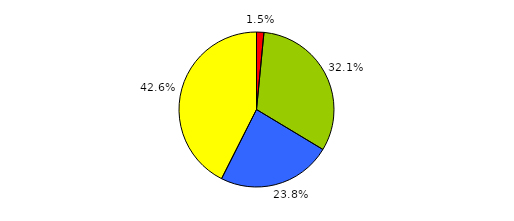
| Category | Series 0 |
|---|---|
| 0 | 16 |
| 1 | 334 |
| 2 | 248 |
| 3 | 443 |